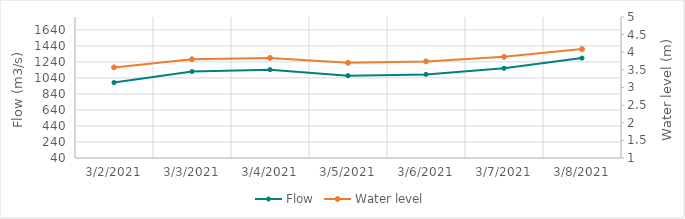
| Category | Flow |
|---|---|
| 2/18/21 | 1100.91 |
| 2/17/21 | 1227.19 |
| 2/16/21 | 1394.09 |
| 2/15/21 | 1566.5 |
| 2/14/21 | 1692.13 |
| 2/13/21 | 1750.82 |
| 2/12/21 | 1769.11 |